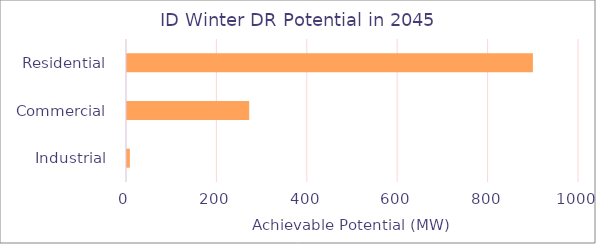
| Category | Series 0 |
|---|---|
|  Residential  | 900.27 |
|  Commercial  | 272.532 |
|  Industrial  | 8.557 |